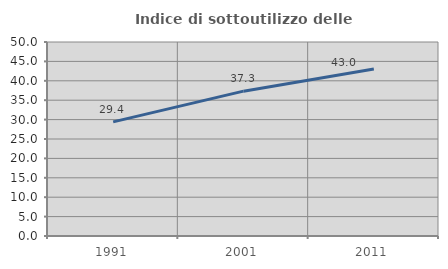
| Category | Indice di sottoutilizzo delle abitazioni  |
|---|---|
| 1991.0 | 29.421 |
| 2001.0 | 37.33 |
| 2011.0 | 43.033 |